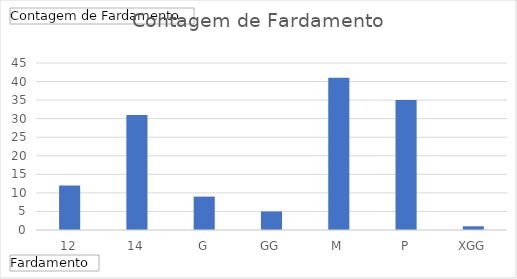
| Category | Total |
|---|---|
| 12 | 12 |
| 14 | 31 |
| G | 9 |
| GG | 5 |
| M | 41 |
| P | 35 |
| XGG | 1 |